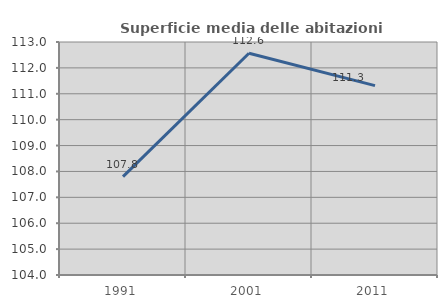
| Category | Superficie media delle abitazioni occupate |
|---|---|
| 1991.0 | 107.803 |
| 2001.0 | 112.564 |
| 2011.0 | 111.316 |